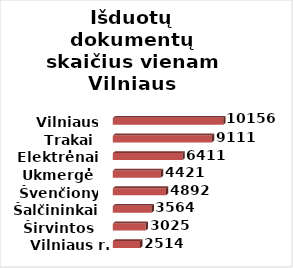
| Category | Series 0 |
|---|---|
| Vilniaus r. | 2514 |
| Širvintos | 3025 |
| Šalčininkai | 3564 |
| Švenčionys | 4892 |
| Ukmergė | 4421 |
| Elektrėnai | 6411 |
| Trakai | 9111 |
| Vilniaus m. | 10156 |